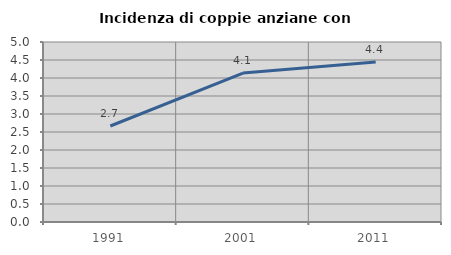
| Category | Incidenza di coppie anziane con figli |
|---|---|
| 1991.0 | 2.667 |
| 2001.0 | 4.138 |
| 2011.0 | 4.444 |